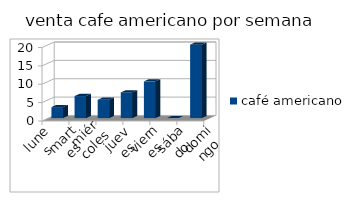
| Category | café americano |
|---|---|
| lunes | 3 |
| martes | 6 |
| miércoles | 5 |
| jueves | 7 |
| viernes | 10 |
| sábado | 0 |
| domingo | 20 |